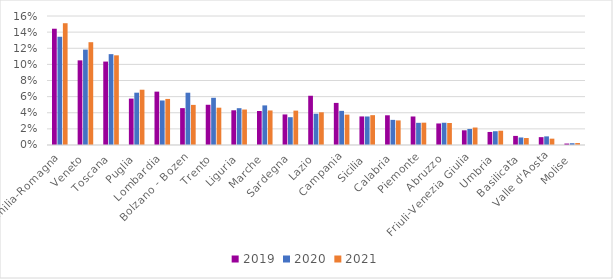
| Category | 2019 | 2020 | 2021 |
|---|---|---|---|
| Emilia-Romagna | 0.144 | 0.134 | 0.151 |
| Veneto | 0.105 | 0.118 | 0.128 |
| Toscana | 0.103 | 0.113 | 0.111 |
| Puglia | 0.058 | 0.065 | 0.069 |
| Lombardia | 0.066 | 0.055 | 0.057 |
| Bolzano - Bozen | 0.046 | 0.065 | 0.05 |
| Trento | 0.05 | 0.059 | 0.046 |
| Liguria | 0.043 | 0.046 | 0.044 |
| Marche | 0.042 | 0.049 | 0.043 |
| Sardegna | 0.038 | 0.034 | 0.043 |
| Lazio | 0.061 | 0.039 | 0.041 |
| Campania | 0.052 | 0.042 | 0.038 |
| Sicilia | 0.035 | 0.035 | 0.037 |
| Calabria | 0.037 | 0.031 | 0.03 |
| Piemonte | 0.035 | 0.028 | 0.028 |
| Abruzzo | 0.027 | 0.028 | 0.027 |
| Friuli-Venezia Giulia | 0.018 | 0.02 | 0.022 |
| Umbria | 0.016 | 0.017 | 0.018 |
| Basilicata | 0.011 | 0.009 | 0.009 |
| Valle d'Aosta | 0.01 | 0.011 | 0.008 |
| Molise | 0.002 | 0.002 | 0.002 |